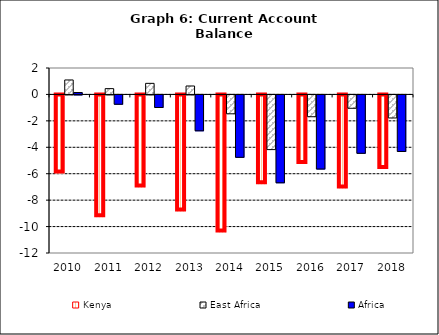
| Category | Kenya | East Africa | Africa |
|---|---|---|---|
| 2010.0 | -5.916 | 1.095 | 0.144 |
| 2011.0 | -9.211 | 0.439 | -0.706 |
| 2012.0 | -6.969 | 0.839 | -0.95 |
| 2013.0 | -8.788 | 0.638 | -2.715 |
| 2014.0 | -10.38 | -1.429 | -4.722 |
| 2015.0 | -6.726 | -4.138 | -6.65 |
| 2016.0 | -5.18 | -1.65 | -5.608 |
| 2017.0 | -7.041 | -1.011 | -4.418 |
| 2018.0 | -5.564 | -1.744 | -4.278 |